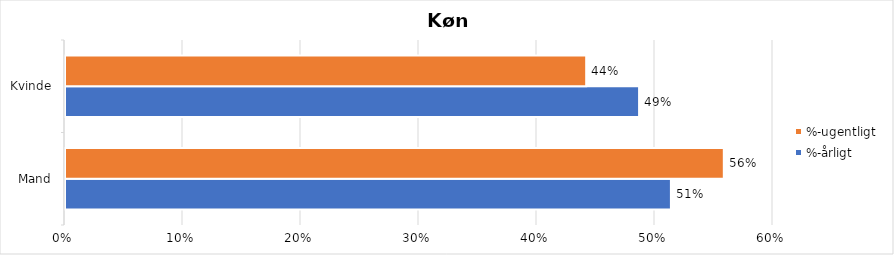
| Category | %-årligt | %-ugentligt |
|---|---|---|
| Mand | 0.513 | 0.558 |
| Kvinde | 0.487 | 0.442 |